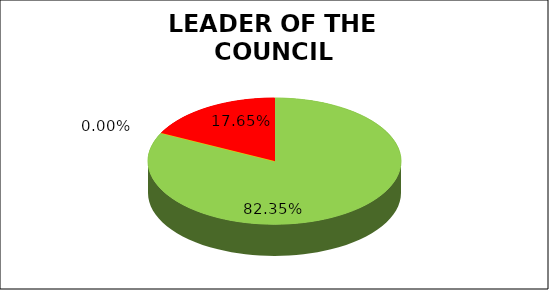
| Category | Q4 |
|---|---|
| Green | 0.824 |
| Amber | 0 |
| Red | 0.176 |